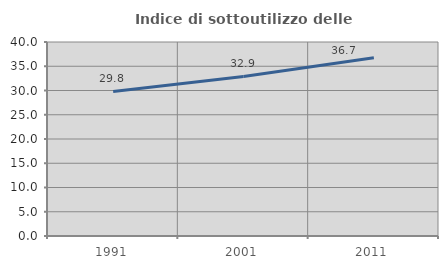
| Category | Indice di sottoutilizzo delle abitazioni  |
|---|---|
| 1991.0 | 29.817 |
| 2001.0 | 32.891 |
| 2011.0 | 36.747 |